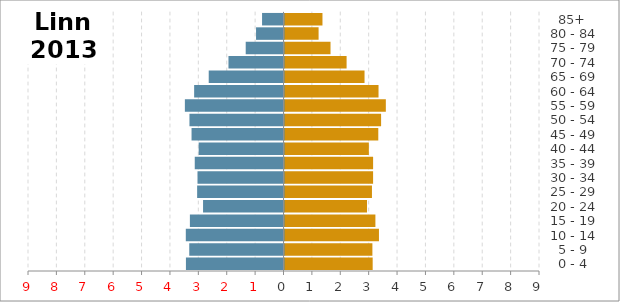
| Category | Female | Male |
|---|---|---|
|   0 - 4 | 3.106 | -3.437 |
|   5 - 9 | 3.096 | -3.32 |
| 10 - 14 | 3.327 | -3.441 |
| 15 - 19 | 3.202 | -3.297 |
| 20 - 24 | 2.907 | -2.834 |
| 25 - 29 | 3.081 | -3.042 |
| 30 - 34 | 3.121 | -3.029 |
| 35 - 39 | 3.121 | -3.126 |
| 40 - 44 | 2.971 | -2.988 |
| 45 - 49 | 3.304 | -3.239 |
| 50 - 54 | 3.403 | -3.313 |
| 55 - 59 | 3.57 | -3.474 |
| 60 - 64 | 3.312 | -3.147 |
| 65 - 69 | 2.819 | -2.634 |
| 70 - 74 | 2.187 | -1.939 |
| 75 - 79 | 1.621 | -1.331 |
| 80 - 84 | 1.201 | -0.967 |
|   85+ | 1.337 | -0.755 |